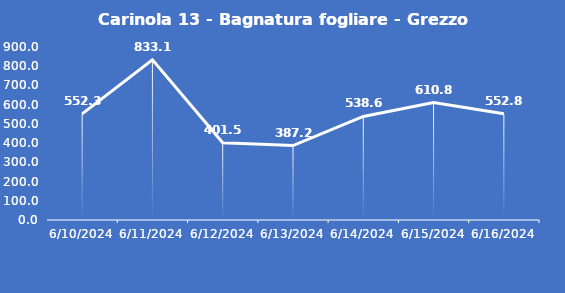
| Category | Carinola 13 - Bagnatura fogliare - Grezzo (min) |
|---|---|
| 6/10/24 | 552.3 |
| 6/11/24 | 833.1 |
| 6/12/24 | 401.5 |
| 6/13/24 | 387.2 |
| 6/14/24 | 538.6 |
| 6/15/24 | 610.8 |
| 6/16/24 | 552.8 |